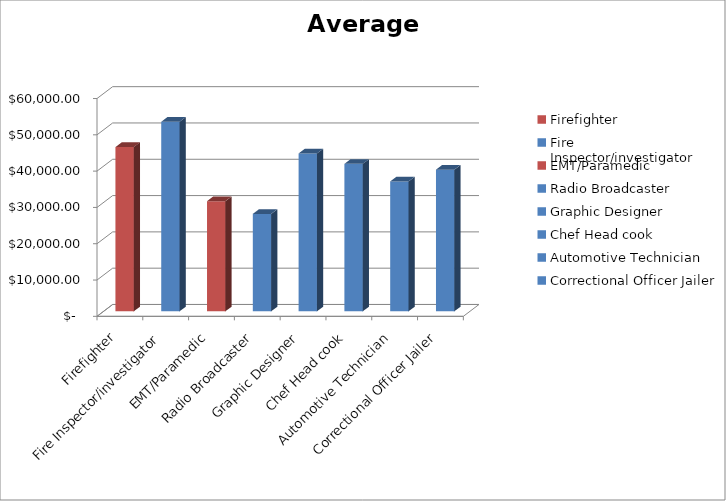
| Category | Average Salary |
|---|---|
| Firefighter | 45250 |
| Fire Inspector/investigator | 52230 |
| EMT/Paramedic | 30360 |
| Radio Broadcaster | 26850 |
| Graphic Designer  | 43500 |
| Chef Head cook | 40630 |
| Automotive Technician | 35790 |
| Correctional Officer Jailer | 39040 |